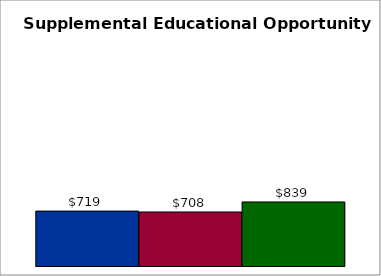
| Category | 50 states and D.C. | SREB states | State |
|---|---|---|---|
| 0 | 719.22 | 707.707 | 839.048 |